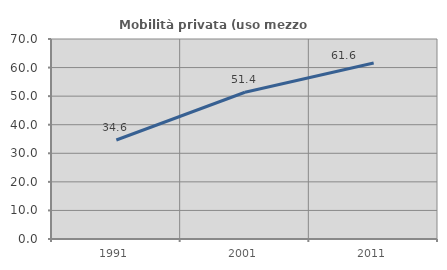
| Category | Mobilità privata (uso mezzo privato) |
|---|---|
| 1991.0 | 34.644 |
| 2001.0 | 51.352 |
| 2011.0 | 61.606 |